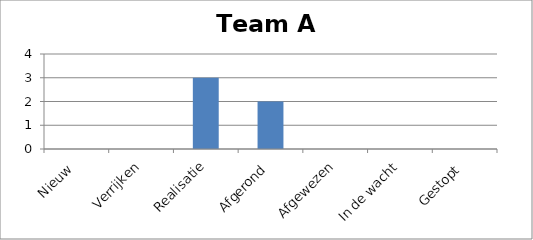
| Category | Team A |
|---|---|
| Nieuw | 0 |
| Verrijken | 0 |
| Realisatie | 3 |
| Afgerond | 2 |
| Afgewezen | 0 |
| In de wacht | 0 |
| Gestopt | 0 |